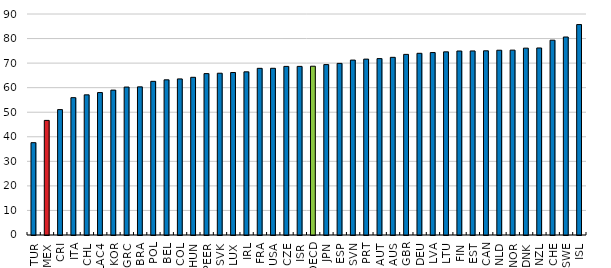
| Category | Series 0 |
|---|---|
| TUR | 37.595 |
| MEX | 46.673 |
| CRI | 51.068 |
| ITA | 55.926 |
| CHL | 57.076 |
| LAC4 | 58.009 |
| KOR | 59.001 |
| GRC | 60.252 |
| BRA | 60.327 |
| POL | 62.579 |
| BEL | 63.191 |
| COL | 63.564 |
| HUN | 64.218 |
| PEER | 65.722 |
| SVK | 65.879 |
| LUX | 66.168 |
| IRL | 66.447 |
| FRA | 67.875 |
| USA | 67.894 |
| CZE | 68.661 |
| ISR | 68.667 |
| OECD | 68.729 |
| JPN | 69.396 |
| ESP | 69.898 |
| SVN | 71.229 |
| PRT | 71.626 |
| AUT | 71.832 |
| AUS | 72.349 |
| GBR | 73.557 |
| DEU | 73.996 |
| LVA | 74.302 |
| LTU | 74.585 |
| FIN | 74.931 |
| EST | 74.956 |
| CAN | 75.012 |
| NLD | 75.249 |
| NOR | 75.287 |
| DNK | 76.094 |
| NZL | 76.163 |
| CHE | 79.336 |
| SWE | 80.633 |
| ISL | 85.698 |